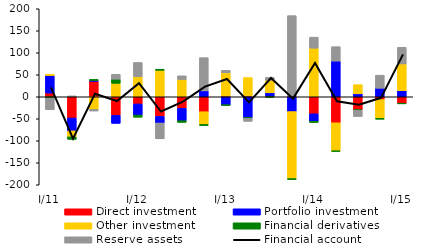
| Category | Direct investment | Portfolio investment | Other investment | Financial derivatives | Reserve assets |
|---|---|---|---|---|---|
| I/11 | 8.394 | 39.909 | 2.964 | -2.567 | -26.789 |
| II | -48.128 | -29.388 | -13.604 | -5.635 | 2.123 |
| III | 35.202 | 1.853 | -28.649 | 2.491 | -3.698 |
| IV | -42.273 | -18.154 | 30.668 | 9.385 | 11.134 |
| I/12 | -16.29 | -25.293 | 45.36 | -4.87 | 32.632 |
| II | -44.641 | -14.957 | 60.168 | 2.453 | -35.982 |
| III | -26.334 | -28.062 | 39.368 | -3.806 | 8.321 |
| IV | -33.997 | 13.465 | -28.955 | -2.395 | 75.502 |
| I/13 | 1.859 | -18.95 | 52.574 | -0.086 | 5.61 |
| II | 1.859 | -47.44 | 41.851 | -1.44 | -6.912 |
| III | 1.859 | 7.148 | 28.263 | -1.061 | 6.889 |
| IV | 1.859 | -33.596 | -152.434 | -2.15 | 182.604 |
| I/14 | -38.685 | -16.995 | 110.469 | -2.764 | 25.08 |
| II | -59.028 | 81.147 | -64.302 | -0.503 | 32.776 |
| III | -29.662 | 6.715 | 20.861 | -0.818 | -14.448 |
| IV | -6.258 | 19.403 | -42.777 | -1.962 | 29.714 |
| I/15 | -15.188 | 13.794 | 60.796 | -0.585 | 38.01 |